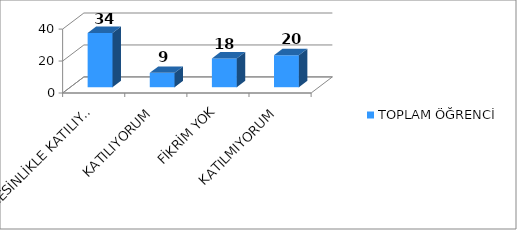
| Category | TOPLAM ÖĞRENCİ |
|---|---|
| KESİNLİKLE KATILIYORUM | 34 |
| KATILIYORUM | 9 |
| FİKRİM YOK | 18 |
| KATILMIYORUM | 20 |